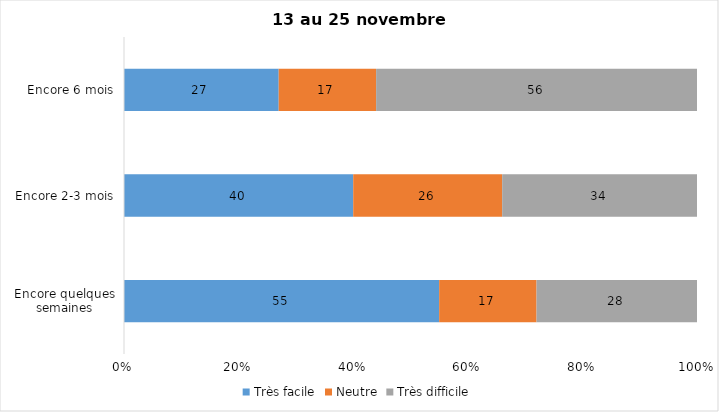
| Category | Très facile | Neutre | Très difficile |
|---|---|---|---|
| Encore quelques semaines | 55 | 17 | 28 |
| Encore 2-3 mois | 40 | 26 | 34 |
| Encore 6 mois | 27 | 17 | 56 |